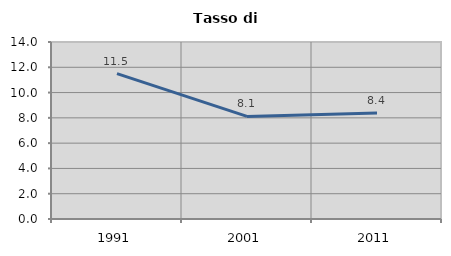
| Category | Tasso di disoccupazione   |
|---|---|
| 1991.0 | 11.495 |
| 2001.0 | 8.116 |
| 2011.0 | 8.386 |